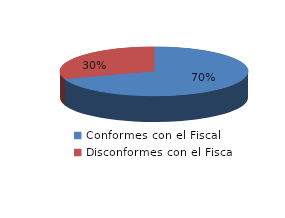
| Category | Series 0 |
|---|---|
| 0 | 37 |
| 1 | 16 |